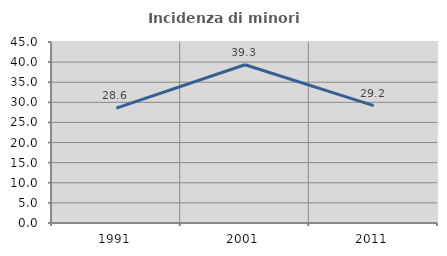
| Category | Incidenza di minori stranieri |
|---|---|
| 1991.0 | 28.571 |
| 2001.0 | 39.344 |
| 2011.0 | 29.167 |